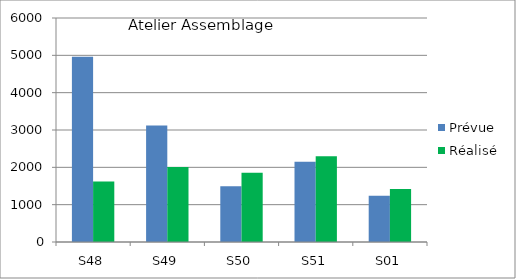
| Category | Prévue | Réalisé |
|---|---|---|
| S48 | 4962 | 1621.328 |
| S49 | 3121 | 2008.558 |
| S50 | 1490 | 1854.302 |
| S51 | 2150 | 2296.503 |
| S01 | 1238 | 1418 |